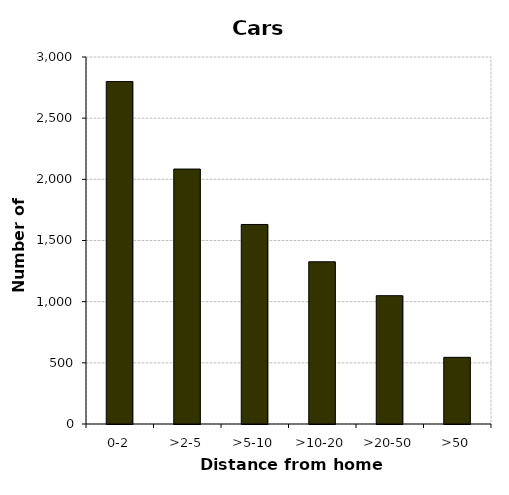
| Category | Cars |
|---|---|
| 0-2 | 2799 |
| >2-5 | 2084 |
| >5-10 | 1631 |
| >10-20 | 1326 |
| >20-50 | 1049 |
| >50 | 545 |